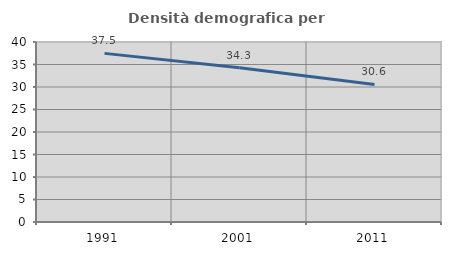
| Category | Densità demografica |
|---|---|
| 1991.0 | 37.471 |
| 2001.0 | 34.292 |
| 2011.0 | 30.567 |